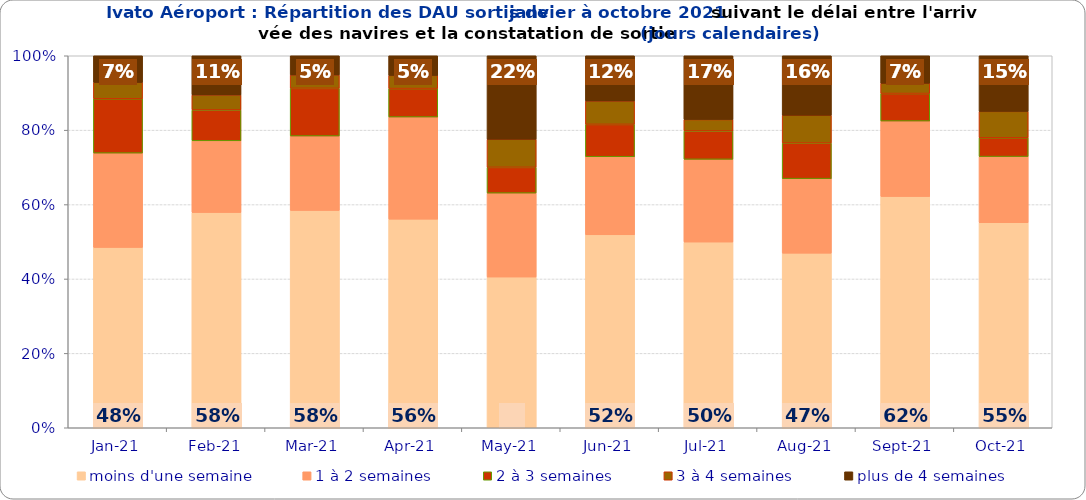
| Category | moins d'une semaine | 1 à 2 semaines | 2 à 3 semaines | 3 à 4 semaines | plus de 4 semaines |
|---|---|---|---|---|---|
| 2021-01-01 | 0.485 | 0.253 | 0.146 | 0.044 | 0.072 |
| 2021-02-01 | 0.578 | 0.193 | 0.083 | 0.04 | 0.105 |
| 2021-03-01 | 0.584 | 0.2 | 0.128 | 0.036 | 0.052 |
| 2021-04-01 | 0.561 | 0.275 | 0.076 | 0.035 | 0.053 |
| 2021-05-01 | 0.405 | 0.226 | 0.069 | 0.076 | 0.224 |
| 2021-06-01 | 0.519 | 0.21 | 0.087 | 0.063 | 0.122 |
| 2021-07-01 | 0.499 | 0.222 | 0.076 | 0.031 | 0.171 |
| 2021-08-01 | 0.469 | 0.2 | 0.096 | 0.075 | 0.16 |
| 2021-09-01 | 0.622 | 0.203 | 0.074 | 0.027 | 0.074 |
| 2021-10-01 | 0.551 | 0.178 | 0.05 | 0.071 | 0.15 |